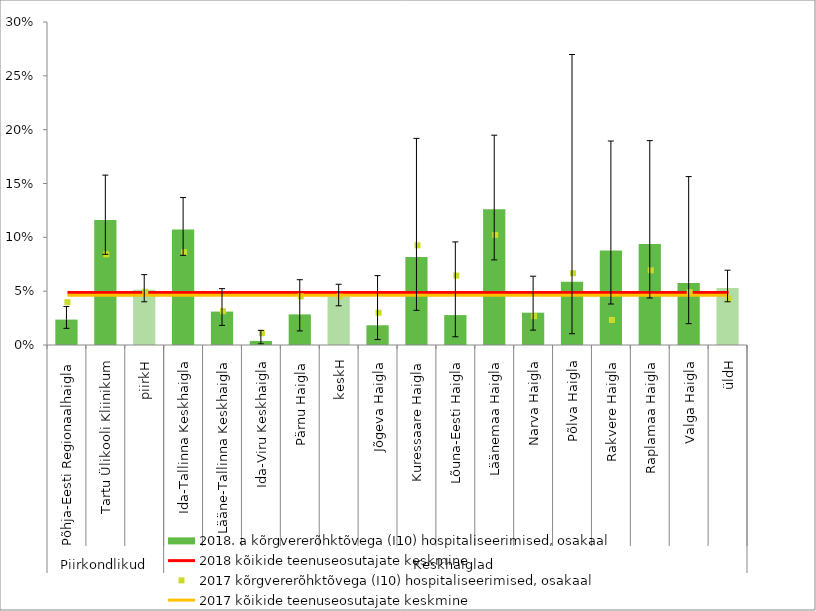
| Category | 2018. a kõrgvererõhktõvega (I10) hospitaliseerimised, osakaal |
|---|---|
| 0 | 0.024 |
| 1 | 0.116 |
| 2 | 0.051 |
| 3 | 0.107 |
| 4 | 0.031 |
| 5 | 0.004 |
| 6 | 0.028 |
| 7 | 0.045 |
| 8 | 0.018 |
| 9 | 0.082 |
| 10 | 0.028 |
| 11 | 0.126 |
| 12 | 0.03 |
| 13 | 0.059 |
| 14 | 0.088 |
| 15 | 0.094 |
| 16 | 0.058 |
| 17 | 0.053 |